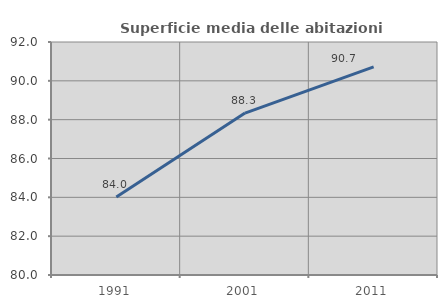
| Category | Superficie media delle abitazioni occupate |
|---|---|
| 1991.0 | 84.014 |
| 2001.0 | 88.34 |
| 2011.0 | 90.715 |